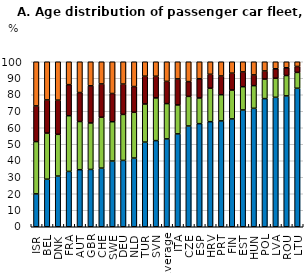
| Category | More than 10 years | 5 to 10 years | 2 to 5 years | Less than 2 years |
|---|---|---|---|---|
| ISR | 19.932 | 31.672 | 21.622 | 26.774 |
| BEL | 28.832 | 27.946 | 20.089 | 23.134 |
| DNK | 30.728 | 25.292 | 20.704 | 23.276 |
| FRA | 33.533 | 33.761 | 18.833 | 13.873 |
| AUT | 34.572 | 29.203 | 17.565 | 18.66 |
| GBR | 34.74 | 28.165 | 22.507 | 14.588 |
| CHE | 35.544 | 30.854 | 20.16 | 13.442 |
| SWE | 39.84 | 23.811 | 17.112 | 19.237 |
| DEU | 40.216 | 27.863 | 18.39 | 13.531 |
| NLD | 41.637 | 27.736 | 15.608 | 15.019 |
| TUR | 51.309 | 23.09 | 16.862 | 8.739 |
| SVN | 52.207 | 25.879 | 13.128 | 8.786 |
| Average | 53.253 | 21.381 | 13.478 | 11.888 |
| ITA | 56.296 | 17.527 | 15.792 | 10.385 |
| CZE | 61.085 | 17.929 | 8.977 | 12.009 |
| ESP | 62.476 | 15.565 | 11.679 | 10.279 |
| HRV | 63.668 | 20.304 | 8.441 | 7.587 |
| PRT | 64.165 | 15.858 | 11.358 | 8.619 |
| FIN | 65.368 | 17.485 | 10.241 | 6.906 |
| EST | 70.783 | 14.102 | 8.958 | 6.157 |
| HUN | 71.786 | 13.728 | 6.514 | 7.972 |
| POL | 77.665 | 11.855 | 4.903 | 5.577 |
| LVA | 78.452 | 11.563 | 5.729 | 4.257 |
| ROU | 79.311 | 12.342 | 4.694 | 3.653 |
| LTU | 83.935 | 9.613 | 3.598 | 2.854 |